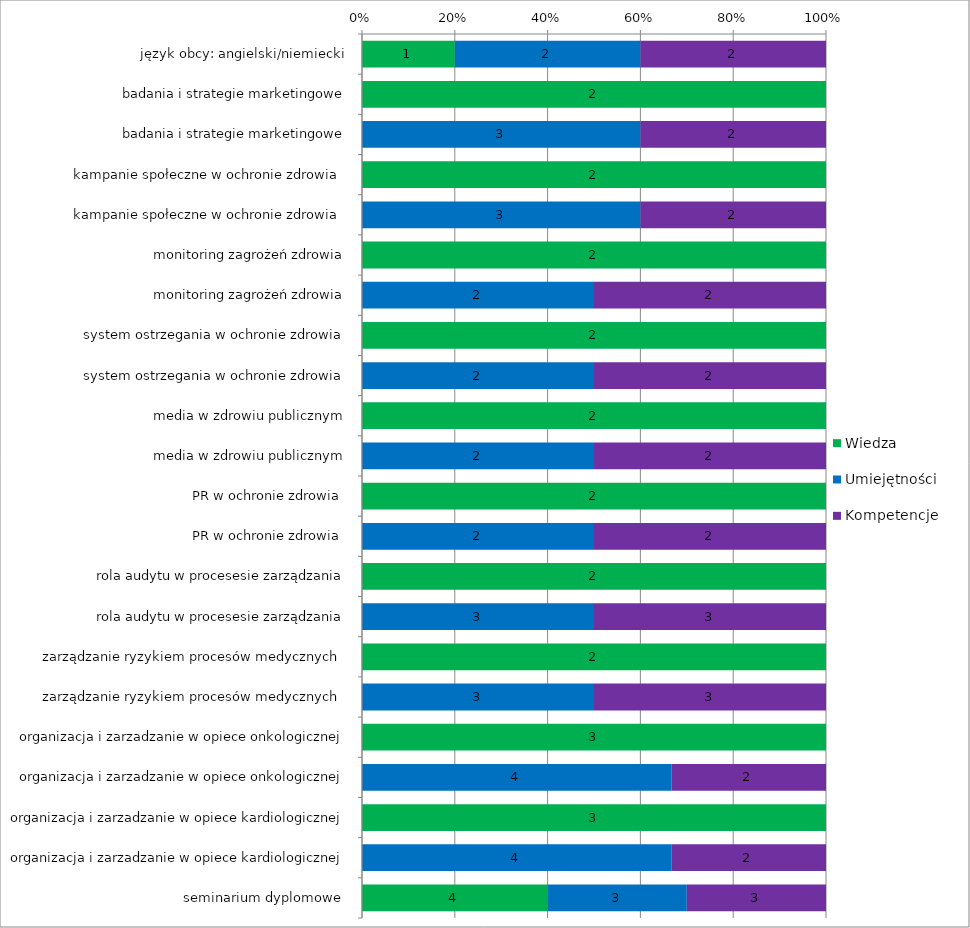
| Category | Wiedza | Umiejętności | Kompetencje |
|---|---|---|---|
| język obcy: angielski/niemiecki | 1 | 2 | 2 |
| badania i strategie marketingowe | 2 | 0 | 0 |
| badania i strategie marketingowe | 0 | 3 | 2 |
| kampanie społeczne w ochronie zdrowia  | 2 | 0 | 0 |
| kampanie społeczne w ochronie zdrowia  | 0 | 3 | 2 |
| monitoring zagrożeń zdrowia | 2 | 0 | 0 |
| monitoring zagrożeń zdrowia | 0 | 2 | 2 |
| system ostrzegania w ochronie zdrowia | 2 | 0 | 0 |
| system ostrzegania w ochronie zdrowia | 0 | 2 | 2 |
| media w zdrowiu publicznym | 2 | 0 | 0 |
| media w zdrowiu publicznym | 0 | 2 | 2 |
| PR w ochronie zdrowia  | 2 | 0 | 0 |
| PR w ochronie zdrowia  | 0 | 2 | 2 |
| rola audytu w procesesie zarządzania | 2 | 0 | 0 |
| rola audytu w procesesie zarządzania | 0 | 3 | 3 |
| zarządzanie ryzykiem procesów medycznych  | 2 | 0 | 0 |
| zarządzanie ryzykiem procesów medycznych  | 0 | 3 | 3 |
| organizacja i zarzadzanie w opiece onkologicznej | 3 | 0 | 0 |
| organizacja i zarzadzanie w opiece onkologicznej | 0 | 4 | 2 |
| organizacja i zarzadzanie w opiece kardiologicznej | 3 | 0 | 0 |
| organizacja i zarzadzanie w opiece kardiologicznej | 0 | 4 | 2 |
| seminarium dyplomowe  | 4 | 3 | 3 |